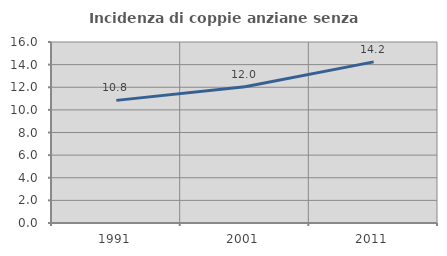
| Category | Incidenza di coppie anziane senza figli  |
|---|---|
| 1991.0 | 10.839 |
| 2001.0 | 12.037 |
| 2011.0 | 14.245 |